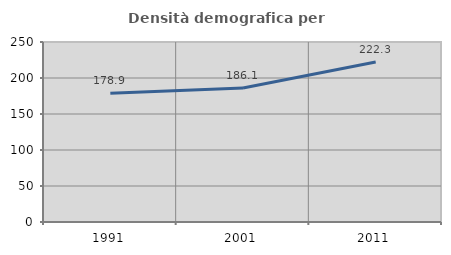
| Category | Densità demografica |
|---|---|
| 1991.0 | 178.894 |
| 2001.0 | 186.059 |
| 2011.0 | 222.266 |